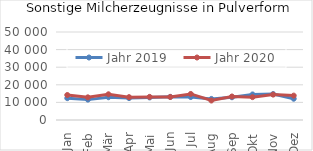
| Category | Jahr 2019 | Jahr 2020 |
|---|---|---|
| Jan | 12407.888 | 14194.257 |
| Feb | 11580.873 | 12879.381 |
| Mär | 12929.434 | 14616.971 |
| Apr | 12451.31 | 12993.609 |
| Mai | 12819.821 | 13138.095 |
| Jun | 13152.088 | 13081.107 |
| Jul | 13047.41 | 14804.544 |
| Aug | 11971.275 | 11069.714 |
| Sep | 12922.947 | 13355.835 |
| Okt | 14527.385 | 12991.52 |
| Nov | 14744.645 | 14424.744 |
| Dez | 12086.779 | 13852.625 |